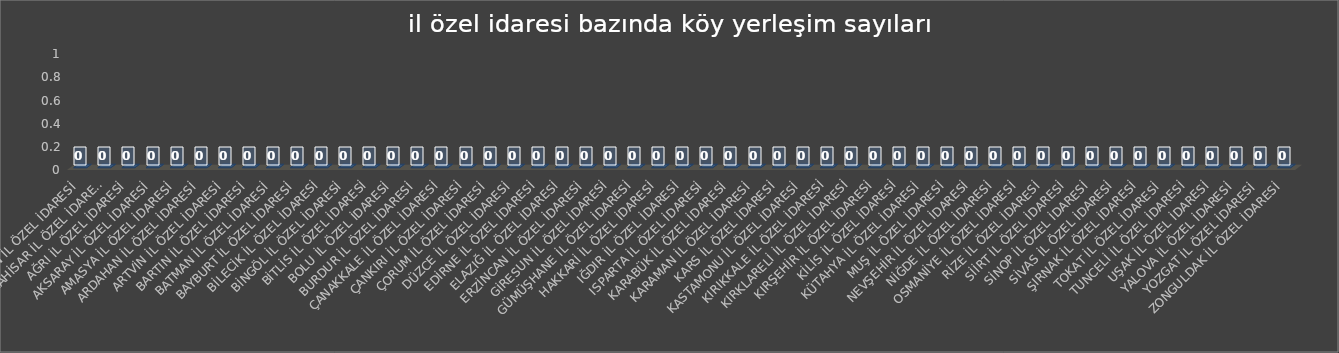
| Category | Series 0 |
|---|---|
| ADIYAMAN İL ÖZEL İDARESİ | 0 |
| AFYONKARAHİSAR İL ÖZEL İDARESİ | 0 |
| AĞRI İL ÖZEL İDARESİ | 0 |
| AKSARAY İL ÖZEL İDARESİ | 0 |
| AMASYA İL ÖZEL İDARESİ | 0 |
| ARDAHAN İL ÖZEL İDARESİ | 0 |
| ARTVİN İL ÖZEL İDARESİ | 0 |
| BARTIN İL ÖZEL İDARESİ | 0 |
| BATMAN İL ÖZEL İDARESİ | 0 |
| BAYBURT İL ÖZEL İDARESİ | 0 |
| BİLECİK İL ÖZEL İDARESİ | 0 |
| BİNGÖL İL ÖZEL İDARESİ | 0 |
| BİTLİS İL ÖZEL İDARESİ | 0 |
| BOLU İL ÖZEL İDARESİ | 0 |
| BURDUR İL ÖZEL İDARESİ | 0 |
| ÇANAKKALE İL ÖZEL İDARESİ | 0 |
| ÇANKIRI İL ÖZEL İDARESİ | 0 |
| ÇORUM İL ÖZEL İDARESİ | 0 |
| DÜZCE İL ÖZEL İDARESİ | 0 |
| EDİRNE İL ÖZEL İDARESİ | 0 |
| ELAZIĞ İL ÖZEL İDARESİ | 0 |
| ERZİNCAN İL ÖZEL İDARESİ | 0 |
| GİRESUN İL ÖZEL İDARESİ | 0 |
| GÜMÜŞHANE İL ÖZEL İDARESİ | 0 |
| HAKKARİ İL ÖZEL İDARESİ | 0 |
| IĞDIR İL ÖZEL İDARESİ | 0 |
| ISPARTA İL ÖZEL İDARESİ | 0 |
| KARABÜK İL ÖZEL İDARESİ | 0 |
| KARAMAN İL ÖZEL İDARESİ | 0 |
| KARS İL ÖZEL İDARESİ | 0 |
| KASTAMONU İL ÖZEL İDARESİ | 0 |
| KIRIKKALE İL ÖZEL İDARESİ | 0 |
| KIRKLARELİ İL ÖZEL İDARESİ | 0 |
| KIRŞEHİR İL ÖZEL İDARESİ | 0 |
| KİLİS İL ÖZEL İDARESİ | 0 |
| KÜTAHYA İL ÖZEL İDARESİ | 0 |
| MUŞ İL ÖZEL İDARESİ | 0 |
| NEVŞEHİR İL ÖZEL İDARESİ | 0 |
| NİĞDE İL ÖZEL İDARESİ | 0 |
| OSMANİYE İL ÖZEL İDARESİ | 0 |
| RİZE İL ÖZEL İDARESİ | 0 |
| SİİRT İL ÖZEL İDARESİ | 0 |
| SİNOP İL ÖZEL İDARESİ | 0 |
| SİVAS İL ÖZEL İDARESİ | 0 |
| ŞIRNAK İL ÖZEL İDARESİ | 0 |
| TOKAT İL ÖZEL İDARESİ | 0 |
| TUNCELİ İL ÖZEL İDARESİ | 0 |
| UŞAK İL ÖZEL İDARESİ | 0 |
| YALOVA İL ÖZEL İDARESİ | 0 |
| YOZGAT İL ÖZEL İDARESİ | 0 |
| ZONGULDAK İL ÖZEL İDARESİ | 0 |